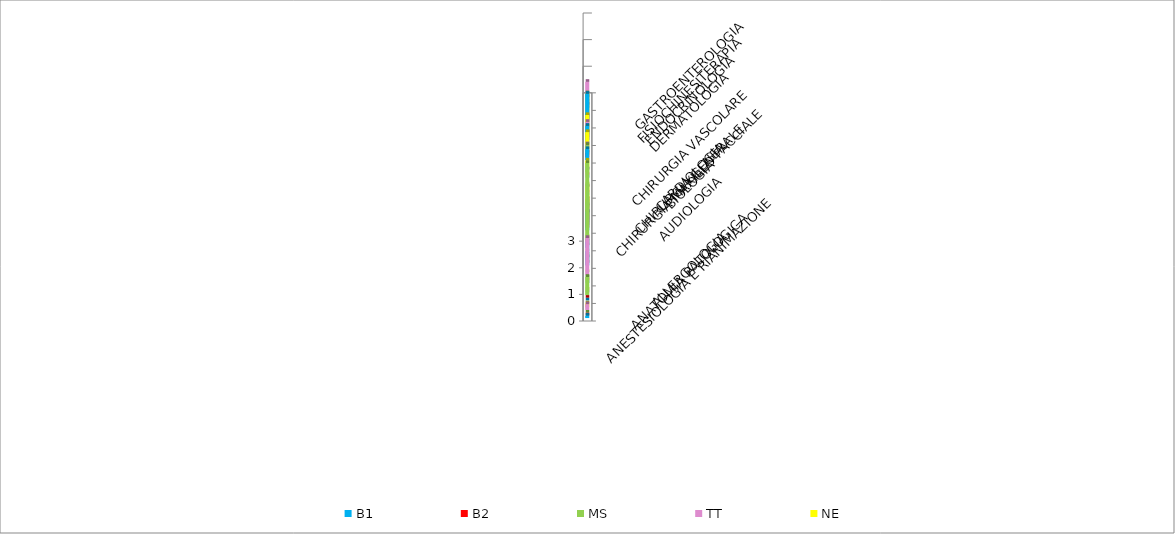
| Category | B1 | B2 | MS | TT | NE |
|---|---|---|---|---|---|
| ALLERGOLOGIA | 0.086 | 0 | 0 | 0.219 | 0.142 |
| ANATOMIA PATOLOGICA | 0 | 0 | 0.684 | 0 | 0 |
| ANESTESIOLOGIA E RIANIMAZIONE | 0 | 0 | 0 | 1.386 | 0 |
| AUDIOLOGIA | 0.543 | 0 | 0.108 | 0 | 0 |
| BIOLOGIA | 0.228 | 0 | 2.986 | 0 | 0 |
| CARDIOLOGIA | 0.7 | 0.552 | 0.864 | 0.638 | 1.253 |
| CHIRURGIA GENERALE | 0.3 | 0.121 | 0.297 | 0.219 | 0.142 |
| CHIRURGIA MAXILLO FACCIALE | 0 | 0 | 0.108 | 0 | 0 |
| CHIRURGIA VASCOLARE | 0 | 0 | 0.108 | 0 | 0.236 |
| DERMATOLOGIA | 0.414 | 0.173 | 0.36 | 0.288 | 0.648 |
| ENDOCRINOLOGIA | 0.628 | 0.286 | 0.371 | 0.471 | 0.628 |
| FISIOCHINESITERAPIA | 1.171 | 0.228 | 0.842 | 0.571 | 0.228 |
| GASTROENTEROLOGIA | 0.1 | 0 | 0.328 | 0.657 | 0 |